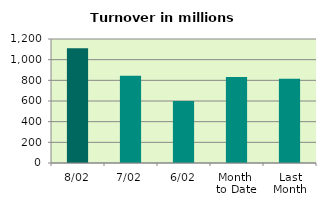
| Category | Series 0 |
|---|---|
| 8/02 | 1111.547 |
| 7/02 | 844.484 |
| 6/02 | 601.039 |
| Month 
to Date | 831.709 |
| Last
Month | 814.821 |